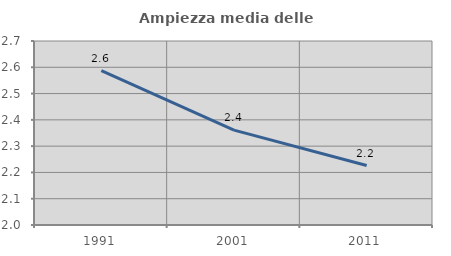
| Category | Ampiezza media delle famiglie |
|---|---|
| 1991.0 | 2.587 |
| 2001.0 | 2.361 |
| 2011.0 | 2.226 |